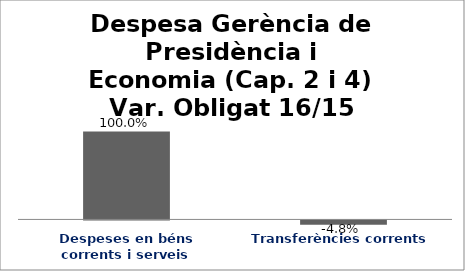
| Category | Series 0 |
|---|---|
| Despeses en béns corrents i serveis | 1 |
| Transferències corrents | -0.048 |